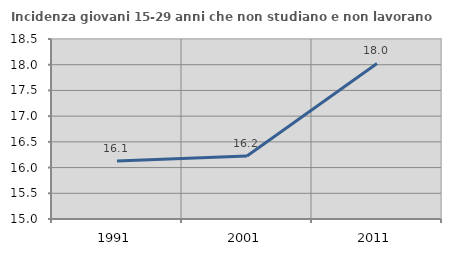
| Category | Incidenza giovani 15-29 anni che non studiano e non lavorano  |
|---|---|
| 1991.0 | 16.13 |
| 2001.0 | 16.223 |
| 2011.0 | 18.025 |